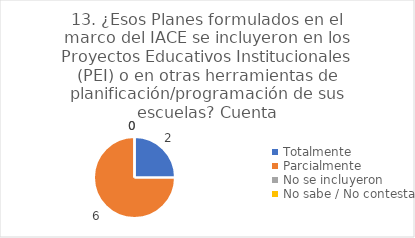
| Category | 13. ¿Esos Planes formulados en el marco del IACE se incluyeron en los Proyectos Educativos Institucionales (PEI) o en otras herramientas de planificación/programación de sus escuelas? |
|---|---|
| Totalmente  | 0.25 |
| Parcialmente  | 0.75 |
| No se incluyeron  | 0 |
| No sabe / No contesta | 0 |